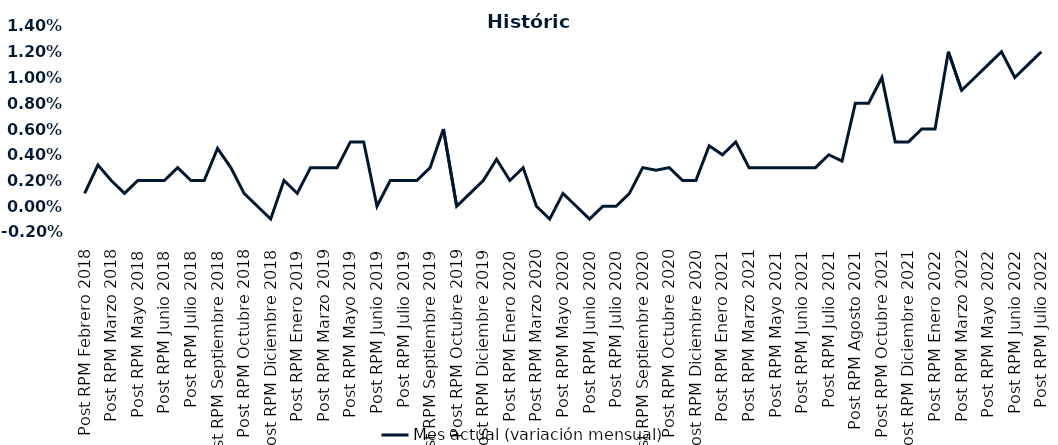
| Category | Mes actual (variación mensual)  |
|---|---|
| Post RPM Febrero 2018 | 0.001 |
| Pre RPM Marzo 2018 | 0.003 |
| Post RPM Marzo 2018 | 0.002 |
| Pre RPM Mayo 2018 | 0.001 |
| Post RPM Mayo 2018 | 0.002 |
| Pre RPM Junio 2018 | 0.002 |
| Post RPM Junio 2018 | 0.002 |
| Pre RPM Julio 2018 | 0.003 |
| Post RPM Julio 2018 | 0.002 |
| Pre RPM Septiembre 2018 | 0.002 |
| Post RPM Septiembre 2018 | 0.004 |
| Pre RPM Octubre 2018 | 0.003 |
| Post RPM Octubre 2018 | 0.001 |
| Pre RPM Diciembre 2018 | 0 |
| Post RPM Diciembre 2018 | -0.001 |
| Pre RPM Enero 2019 | 0.002 |
| Post RPM Enero 2019 | 0.001 |
| Pre RPM Marzo 2019 | 0.003 |
| Post RPM Marzo 2019 | 0.003 |
| Pre RPM Mayo 2019 | 0.003 |
| Post RPM Mayo 2019 | 0.005 |
| Pre RPM Junio 2019 | 0.005 |
| Post RPM Junio 2019 | 0 |
| Pre RPM Julio 2019 | 0.002 |
| Post RPM Julio 2019 | 0.002 |
| Pre RPM Septiembre 2019 | 0.002 |
| Post RPM Septiembre 2019 | 0.003 |
| Pre RPM Octubre 2019 | 0.006 |
| Post RPM Octubre 2019 | 0 |
| Pre RPM Diciembre 2019 | 0.001 |
| Post RPM Diciembre 2019 | 0.002 |
| Pre RPM Enero 2020 | 0.004 |
| Post RPM Enero 2020 | 0.002 |
| Pre RPM Marzo 2020 | 0.003 |
| Post RPM Marzo 2020 | 0 |
| Pre RPM Mayo 2020 | -0.001 |
| Post RPM Mayo 2020 | 0.001 |
| Pre RPM Junio 2020 | 0 |
| Post RPM Junio 2020 | -0.001 |
| Pre RPM Julio 2020 | 0 |
| Post RPM Julio 2020 | 0 |
| Pre RPM Septiembre 2020 | 0.001 |
| Post RPM Septiembre 2020 | 0.003 |
| Pre RPM Octubre 2020 | 0.003 |
| Post RPM Octubre 2020 | 0.003 |
| Pre RPM Diciembre 2020 | 0.002 |
| Post RPM Diciembre 2020 | 0.002 |
| Pre RPM Enero 2021 | 0.005 |
| Post RPM Enero 2021 | 0.004 |
| Pre RPM Marzo 2021 | 0.005 |
| Post RPM Marzo 2021 | 0.003 |
| Pre RPM Mayo 2021 | 0.003 |
| Post RPM Mayo 2021 | 0.003 |
| Pre RPM Junio 2021 | 0.003 |
| Post RPM Junio 2021 | 0.003 |
| Pre RPM Julio 2021 | 0.003 |
| Post RPM Julio 2021 | 0.004 |
| Pre RPM Agosto 2021 | 0.004 |
| Post RPM Agosto 2021 | 0.008 |
| Pre RPM Octubre 2021 | 0.008 |
| Post RPM Octubre 2021 | 0.01 |
| Pre RPM Diciembre 2021 | 0.005 |
| Post RPM Diciembre 2021 | 0.005 |
| Pre RPM Enero 2022 | 0.006 |
| Post RPM Enero 2022 | 0.006 |
| Pre RPM Marzo 2022 | 0.012 |
| Post RPM Marzo 2022 | 0.009 |
| Pre RPM Mayo 2022 | 0.01 |
| Post RPM Mayo 2022 | 0.011 |
| Pre RPM Junio 2022 | 0.012 |
| Post RPM Junio 2022 | 0.01 |
| Pre RPM Julio 2022 | 0.011 |
| Post RPM Julio 2022 | 0.012 |